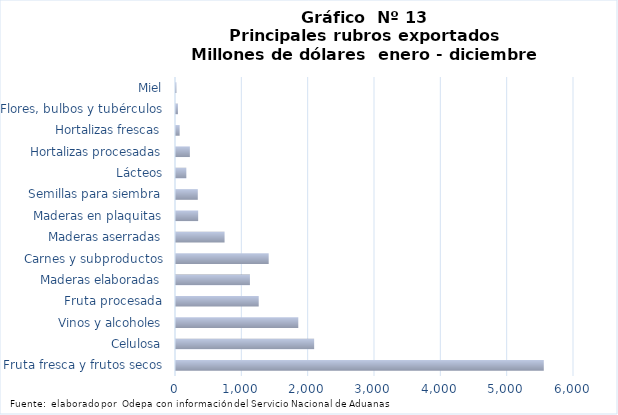
| Category | Series 7 |
|---|---|
| Fruta fresca y frutos secos | 5544602.837 |
| Celulosa | 2082698.924 |
| Vinos y alcoholes | 1843554.12 |
| Fruta procesada | 1246963.357 |
| Maderas elaboradas | 1114412.285 |
| Carnes y subproductos | 1397279.511 |
| Maderas aserradas | 732254.345 |
| Maderas en plaquitas | 334102.319 |
| Semillas para siembra | 328553.576 |
| Lácteos | 155822.998 |
| Hortalizas procesadas | 208924.728 |
| Hortalizas frescas | 55029.48 |
| Flores, bulbos y tubérculos | 29151.317 |
| Miel | 6165.629 |